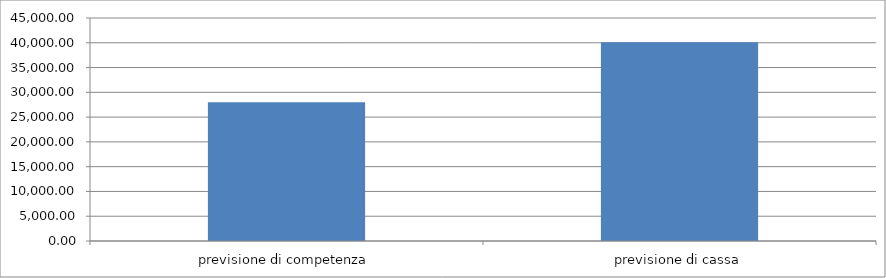
| Category | Series 0 |
|---|---|
| previsione di competenza | 28000 |
| previsione di cassa | 40105.73 |